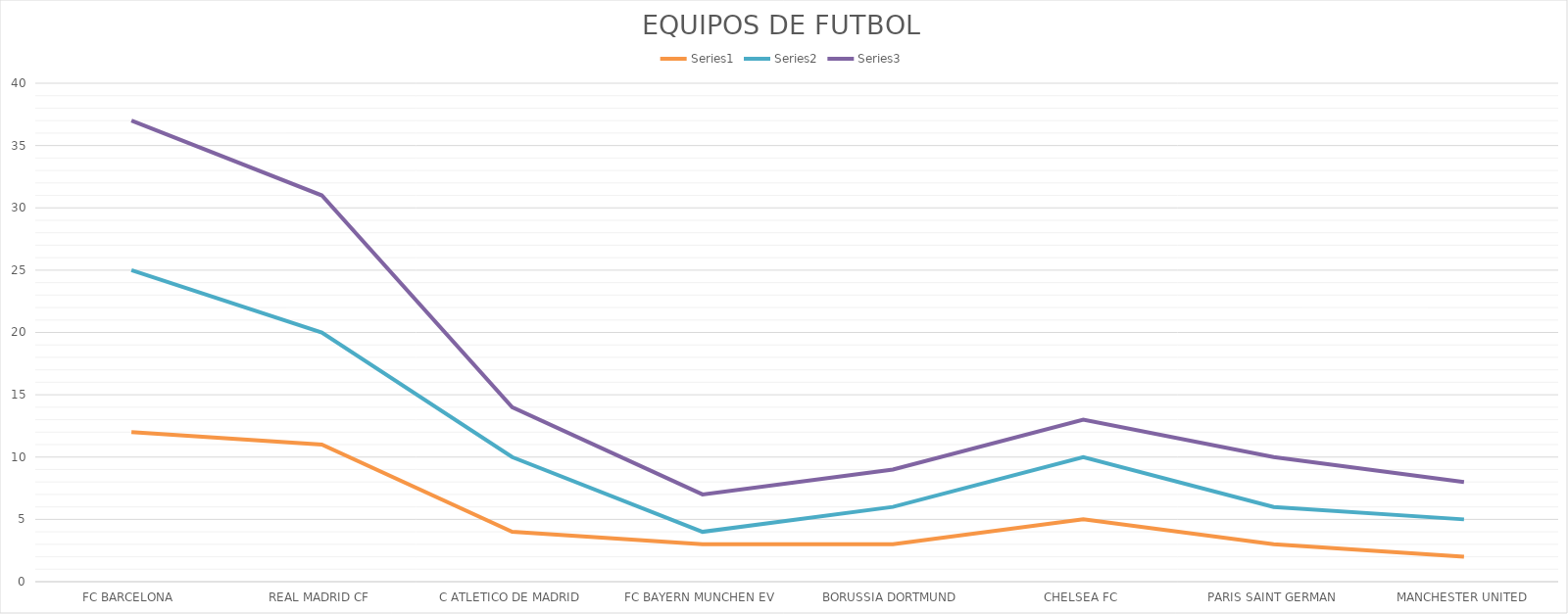
| Category | Series 0 | Series 1 | Series 2 |
|---|---|---|---|
| FC BARCELONA | 12 | 13 | 12 |
| REAL MADRID CF | 11 | 9 | 11 |
| C ATLETICO DE MADRID | 4 | 6 | 4 |
| FC BAYERN MUNCHEN EV | 3 | 1 | 3 |
| BORUSSIA DORTMUND | 3 | 3 | 3 |
| CHELSEA FC | 5 | 5 | 3 |
| PARIS SAINT GERMAN | 3 | 3 | 4 |
| MANCHESTER UNITED | 2 | 3 | 3 |